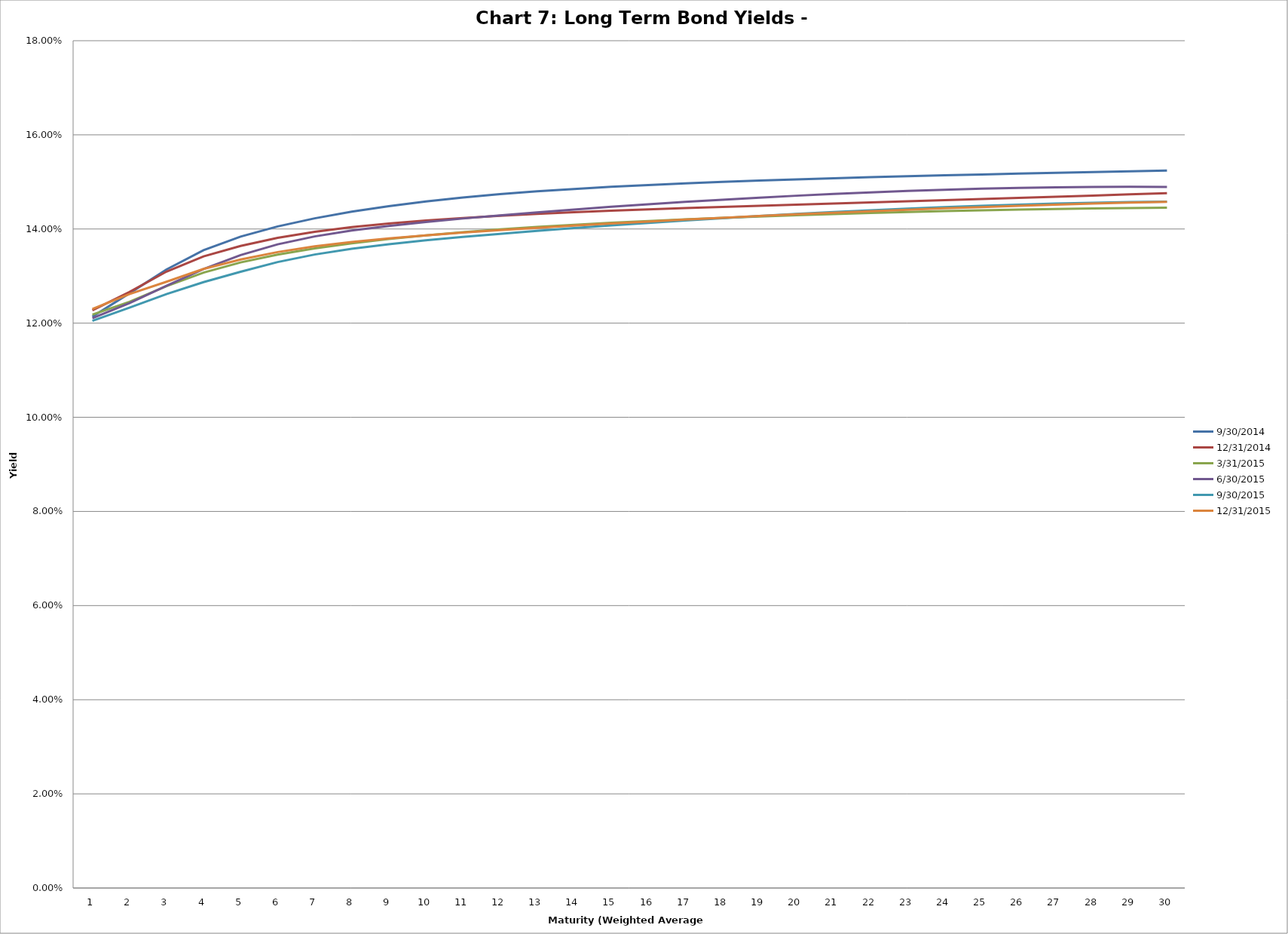
| Category | 9/30/2014 | 12/31/2014 | 3/31/2015 | 6/30/2015 | 9/30/2015 | 12/31/2015 |
|---|---|---|---|---|---|---|
| 0 | 0.121 | 0.123 | 0.122 | 0.121 | 0.12 | 0.123 |
| 1 | 0.126 | 0.127 | 0.125 | 0.124 | 0.123 | 0.126 |
| 2 | 0.131 | 0.131 | 0.128 | 0.128 | 0.126 | 0.129 |
| 3 | 0.136 | 0.134 | 0.131 | 0.131 | 0.129 | 0.132 |
| 4 | 0.138 | 0.136 | 0.133 | 0.134 | 0.131 | 0.134 |
| 5 | 0.141 | 0.138 | 0.135 | 0.137 | 0.133 | 0.135 |
| 6 | 0.142 | 0.139 | 0.136 | 0.138 | 0.135 | 0.136 |
| 7 | 0.144 | 0.14 | 0.137 | 0.14 | 0.136 | 0.137 |
| 8 | 0.145 | 0.141 | 0.138 | 0.141 | 0.137 | 0.138 |
| 9 | 0.146 | 0.142 | 0.139 | 0.141 | 0.138 | 0.139 |
| 10 | 0.147 | 0.142 | 0.139 | 0.142 | 0.138 | 0.139 |
| 11 | 0.147 | 0.143 | 0.14 | 0.143 | 0.139 | 0.14 |
| 12 | 0.148 | 0.143 | 0.14 | 0.144 | 0.14 | 0.14 |
| 13 | 0.149 | 0.144 | 0.141 | 0.144 | 0.14 | 0.141 |
| 14 | 0.149 | 0.144 | 0.141 | 0.145 | 0.141 | 0.141 |
| 15 | 0.149 | 0.144 | 0.142 | 0.145 | 0.141 | 0.142 |
| 16 | 0.15 | 0.144 | 0.142 | 0.146 | 0.142 | 0.142 |
| 17 | 0.15 | 0.145 | 0.142 | 0.146 | 0.142 | 0.142 |
| 18 | 0.15 | 0.145 | 0.143 | 0.147 | 0.143 | 0.143 |
| 19 | 0.151 | 0.145 | 0.143 | 0.147 | 0.143 | 0.143 |
| 20 | 0.151 | 0.145 | 0.143 | 0.147 | 0.144 | 0.143 |
| 21 | 0.151 | 0.146 | 0.143 | 0.148 | 0.144 | 0.144 |
| 22 | 0.151 | 0.146 | 0.144 | 0.148 | 0.144 | 0.144 |
| 23 | 0.151 | 0.146 | 0.144 | 0.148 | 0.145 | 0.144 |
| 24 | 0.152 | 0.146 | 0.144 | 0.149 | 0.145 | 0.145 |
| 25 | 0.152 | 0.147 | 0.144 | 0.149 | 0.145 | 0.145 |
| 26 | 0.152 | 0.147 | 0.144 | 0.149 | 0.145 | 0.145 |
| 27 | 0.152 | 0.147 | 0.144 | 0.149 | 0.146 | 0.145 |
| 28 | 0.152 | 0.147 | 0.144 | 0.149 | 0.146 | 0.146 |
| 29 | 0.152 | 0.148 | 0.145 | 0.149 | 0.146 | 0.146 |